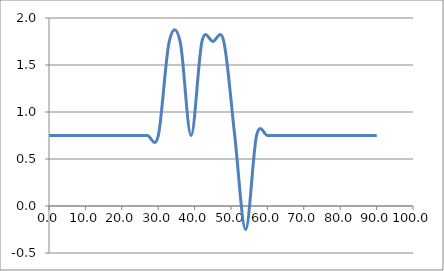
| Category | Elevation (in.) |
|---|---|
| 0.024 | 0.75 |
| 3.024 | 0.75 |
| 6.024 | 0.75 |
| 9.024000000000001 | 0.75 |
| 12.024000000000001 | 0.75 |
| 15.024000000000001 | 0.75 |
| 18.024 | 0.75 |
| 21.024 | 0.75 |
| 24.023999999999997 | 0.75 |
| 27.023999999999997 | 0.75 |
| 30.023999999999997 | 0.75 |
| 33.024 | 1.75 |
| 36.024 | 1.75 |
| 39.024 | 0.75 |
| 42.024 | 1.75 |
| 45.024 | 1.75 |
| 48.024 | 1.75 |
| 51.024 | 0.75 |
| 54.024 | -0.25 |
| 57.024 | 0.75 |
| 60.024 | 0.75 |
| 63.024 | 0.75 |
| 66.024 | 0.75 |
| 69.024 | 0.75 |
| 72.024 | 0.75 |
| 75.024 | 0.75 |
| 78.024 | 0.75 |
| 81.024 | 0.75 |
| 84.024 | 0.75 |
| 87.024 | 0.75 |
| 90.024 | 0.75 |